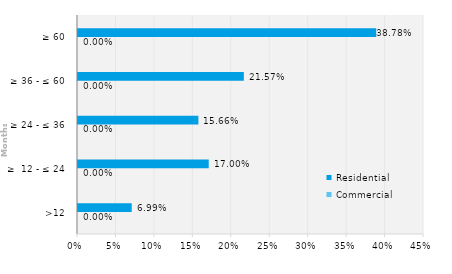
| Category | Commercial | Residential |
|---|---|---|
| >12 | 0 | 0.07 |
| ≥  12 - ≤ 24 | 0 | 0.17 |
| ≥ 24 - ≤ 36 | 0 | 0.157 |
| ≥ 36 - ≤ 60 | 0 | 0.216 |
| ≥ 60 | 0 | 0.388 |